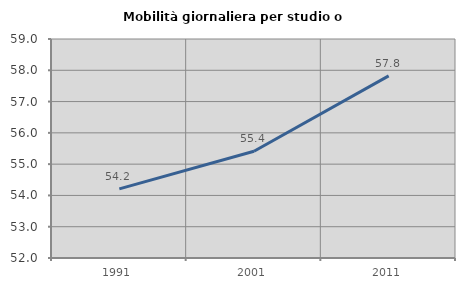
| Category | Mobilità giornaliera per studio o lavoro |
|---|---|
| 1991.0 | 54.208 |
| 2001.0 | 55.412 |
| 2011.0 | 57.822 |